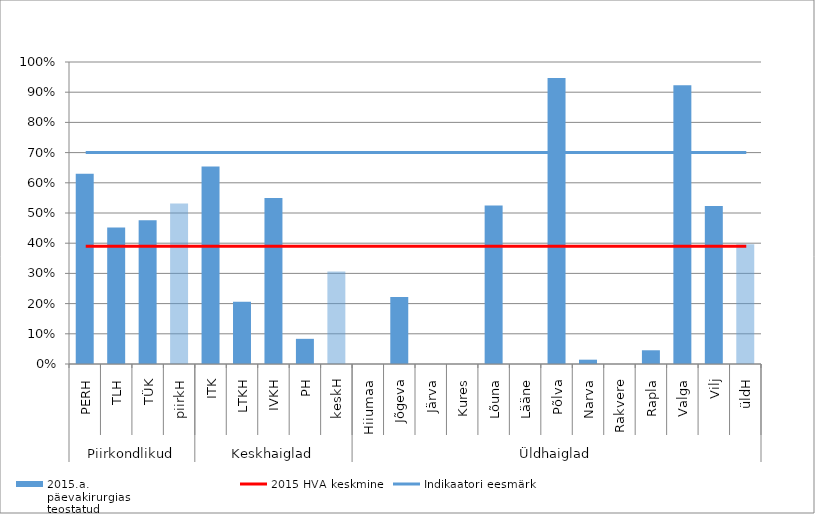
| Category | 2015.a.
päevakirurgias
teostatud
plaanilised kubemesonga op % |
|---|---|
| 0 | 0.63 |
| 1 | 0.452 |
| 2 | 0.476 |
| 3 | 0.532 |
| 4 | 0.654 |
| 5 | 0.206 |
| 6 | 0.55 |
| 7 | 0.083 |
| 8 | 0.306 |
| 9 | 0 |
| 10 | 0.222 |
| 11 | 0 |
| 12 | 0 |
| 13 | 0.525 |
| 14 | 0 |
| 15 | 0.947 |
| 16 | 0.014 |
| 17 | 0 |
| 18 | 0.045 |
| 19 | 0.923 |
| 20 | 0.523 |
| 21 | 0.397 |